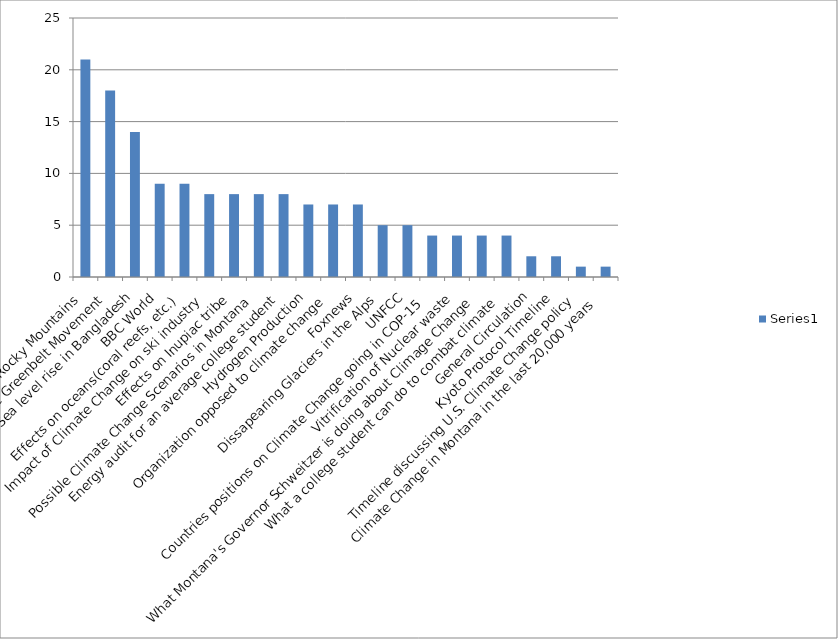
| Category | Series 0 |
|---|---|
| Fire in Rocky Mountains | 21 |
| The Greenbelt Movement | 18 |
| Sea level rise in Bangladesh | 14 |
| BBC World | 9 |
| Effects on oceans(coral reefs, etc.) | 9 |
| Impact of Climate Change on ski industry | 8 |
| Effects on Inupiac tribe | 8 |
| Possible Climate Change Scenarios in Montana | 8 |
| Energy audit for an average college student | 8 |
| Hydrogen Production | 7 |
| Organization opposed to climate change | 7 |
| Foxnews | 7 |
| Dissapearing Glaciers in the Alps | 5 |
| UNFCC | 5 |
| Countries positions on Climate Change going in COP-15 | 4 |
| Vitrification of Nuclear waste | 4 |
| What Montana's Governor Schweitzer is doing about Climage Change | 4 |
| What a college student can do to combat climate | 4 |
| General Circulation | 2 |
| Kyoto Protocol Timeline | 2 |
| Timeline discussing U.S. Climate Change policy | 1 |
| Climate Change in Montana in the last 20,000 years | 1 |